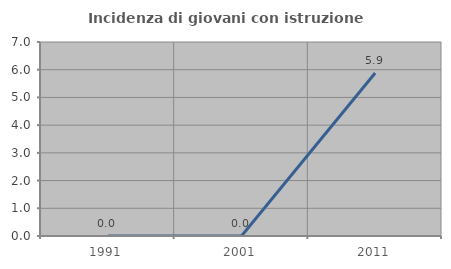
| Category | Incidenza di giovani con istruzione universitaria |
|---|---|
| 1991.0 | 0 |
| 2001.0 | 0 |
| 2011.0 | 5.882 |